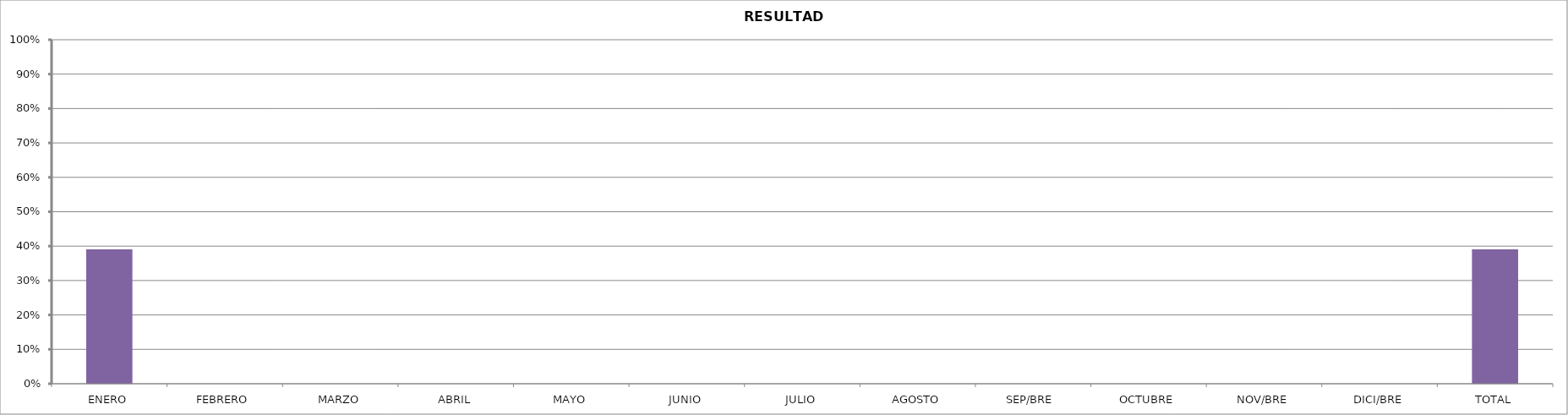
| Category | RESULTADO |
|---|---|
| ENERO | 0.39 |
| FEBRERO | 0 |
| MARZO | 0 |
| ABRIL | 0 |
| MAYO | 0 |
| JUNIO | 0 |
| JULIO | 0 |
| AGOSTO | 0 |
| SEP/BRE  | 0 |
| OCTUBRE | 0 |
| NOV/BRE | 0 |
| DICI/BRE | 0 |
| TOTAL | 0.39 |